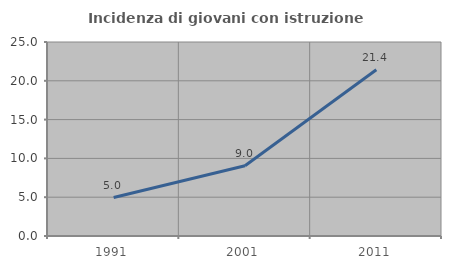
| Category | Incidenza di giovani con istruzione universitaria |
|---|---|
| 1991.0 | 4.96 |
| 2001.0 | 9.043 |
| 2011.0 | 21.419 |